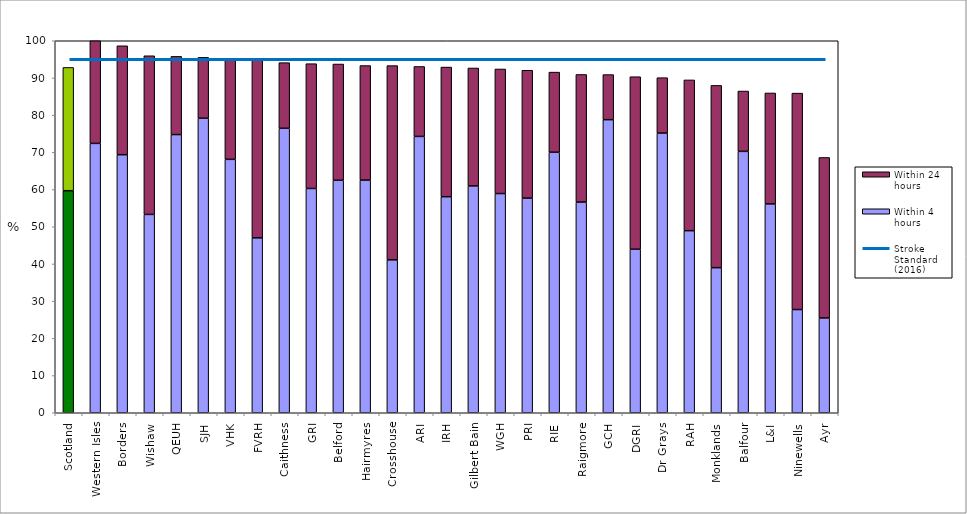
| Category | Within 4 hours | Within 24 hours |
|---|---|---|
| Scotland | 59.692 | 33.137 |
| Western Isles | 72.414 | 27.586 |
| Borders | 69.369 | 29.279 |
| Wishaw | 53.314 | 42.651 |
| QEUH | 74.786 | 21.012 |
| SJH | 79.182 | 16.357 |
| VHK | 68.12 | 27.068 |
| FVRH | 47.025 | 47.985 |
| Caithness | 76.471 | 17.647 |
| GRI | 60.292 | 33.549 |
| Belford | 62.5 | 31.25 |
| Hairmyres | 62.54 | 30.794 |
| Crosshouse | 41.11 | 52.207 |
| ARI | 74.286 | 18.797 |
| IRH | 58.081 | 34.848 |
| Gilbert Bain | 60.976 | 31.707 |
| WGH | 58.929 | 33.482 |
| PRI | 57.709 | 34.361 |
| RIE | 70.031 | 21.54 |
| Raigmore | 56.634 | 34.304 |
| GCH | 78.788 | 12.121 |
| DGRI | 43.961 | 46.377 |
| Dr Grays | 75.177 | 14.894 |
| RAH | 48.947 | 40.526 |
| Monklands | 39 | 49 |
| Balfour | 70.27 | 16.216 |
| L&I | 56.14 | 29.825 |
| Ninewells | 27.743 | 58.178 |
| Ayr | 25.49 | 43.137 |